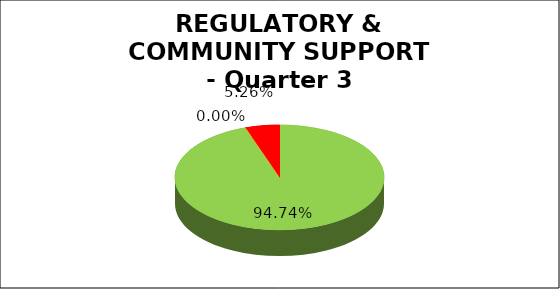
| Category | Q3 |
|---|---|
| Green | 0.947 |
| Amber | 0 |
| Red | 0.053 |